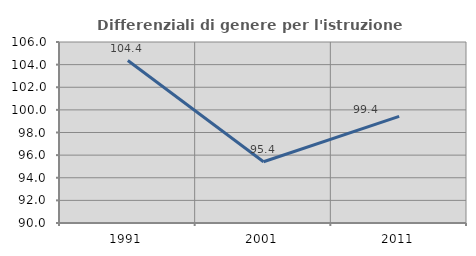
| Category | Differenziali di genere per l'istruzione superiore |
|---|---|
| 1991.0 | 104.361 |
| 2001.0 | 95.413 |
| 2011.0 | 99.425 |